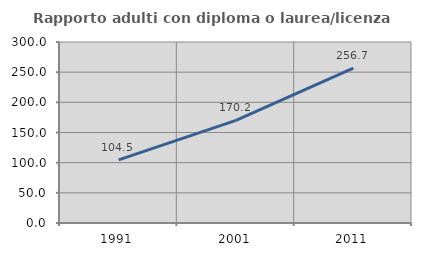
| Category | Rapporto adulti con diploma o laurea/licenza media  |
|---|---|
| 1991.0 | 104.501 |
| 2001.0 | 170.182 |
| 2011.0 | 256.654 |